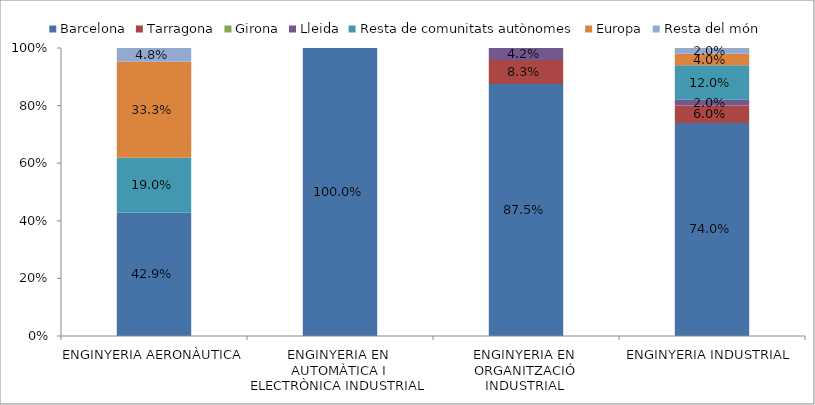
| Category | Barcelona | Tarragona | Girona | Lleida | Resta de comunitats autònomes | Europa | Resta del món |
|---|---|---|---|---|---|---|---|
| ENGINYERIA AERONÀUTICA | 0.429 | 0 | 0 | 0 | 0.19 | 0.333 | 0.048 |
| ENGINYERIA EN AUTOMÀTICA I ELECTRÒNICA INDUSTRIAL | 1 | 0 | 0 | 0 | 0 | 0 | 0 |
| ENGINYERIA EN ORGANITZACIÓ INDUSTRIAL | 0.875 | 0.083 | 0 | 0.042 | 0 | 0 | 0 |
| ENGINYERIA INDUSTRIAL | 0.74 | 0.06 | 0 | 0.02 | 0.12 | 0.04 | 0.02 |